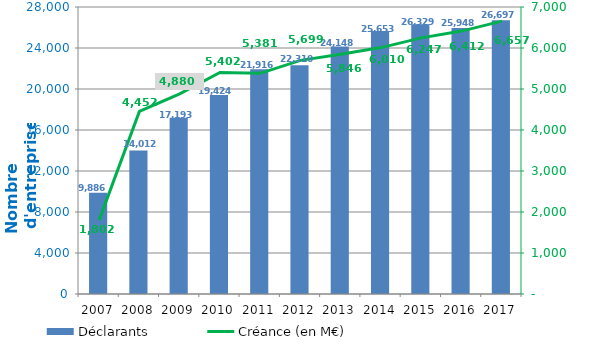
| Category | Déclarants |
|---|---|
| 2007.0 | 9886 |
| 2008.0 | 14012 |
| 2009.0 | 17193 |
| 2010.0 | 19424 |
| 2011.0 | 21916 |
| 2012.0 | 22310 |
| 2013.0 | 24148 |
| 2014.0 | 25653 |
| 2015.0 | 26329 |
| 2016.0 | 25948 |
| 2017.0 | 26697 |